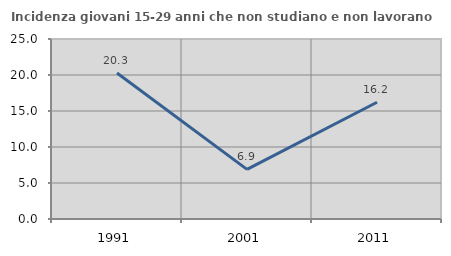
| Category | Incidenza giovani 15-29 anni che non studiano e non lavorano  |
|---|---|
| 1991.0 | 20.283 |
| 2001.0 | 6.897 |
| 2011.0 | 16.216 |